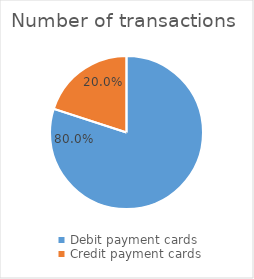
| Category | Number of transactions  |
|---|---|
| Debit payment cards | 355980943 |
| Credit payment cards | 88963106 |